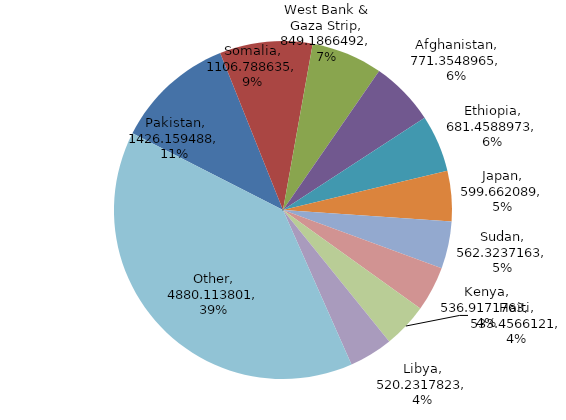
| Category | Series 0 |
|---|---|
| Pakistan | 1426.159 |
| Somalia | 1106.789 |
| West Bank & Gaza Strip | 849.187 |
| Afghanistan | 771.355 |
| Ethiopia | 681.459 |
| Japan | 599.662 |
| Sudan | 562.324 |
| Kenya | 536.917 |
| Haiti | 533.457 |
| Libya | 520.232 |
| Other | 4880.114 |